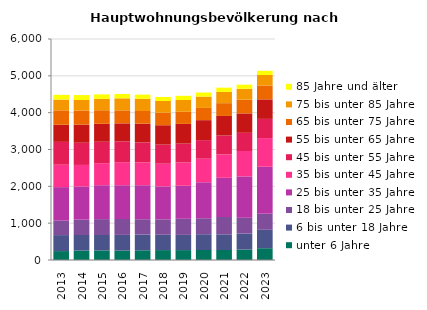
| Category | unter 6 Jahre | 6 bis unter 18 Jahre | 18 bis unter 25 Jahre | 25 bis unter 35 Jahre | 35 bis unter 45 Jahre | 45 bis unter 55 Jahre | 55 bis unter 65 Jahre | 65 bis unter 75 Jahre | 75 bis unter 85 Jahre | 85 Jahre und älter |
|---|---|---|---|---|---|---|---|---|---|---|
| 2013.0 | 242 | 434 | 392 | 911 | 608 | 620 | 464 | 392 | 293 | 128 |
| 2014.0 | 257 | 422 | 416 | 902 | 584 | 602 | 494 | 383 | 284 | 134 |
| 2015.0 | 260 | 419 | 431 | 920 | 599 | 581 | 488 | 368 | 308 | 122 |
| 2016.0 | 254 | 428 | 431 | 917 | 626 | 566 | 488 | 353 | 326 | 119 |
| 2017.0 | 263 | 428 | 416 | 923 | 620 | 542 | 509 | 344 | 329 | 116 |
| 2018.0 | 269 | 416 | 419 | 893 | 617 | 518 | 527 | 341 | 317 | 110 |
| 2019.0 | 269 | 413 | 437 | 896 | 632 | 512 | 536 | 329 | 320 | 113 |
| 2020.0 | 272 | 428 | 434 | 977 | 638 | 506 | 542 | 332 | 308 | 110 |
| 2021.0 | 272 | 425 | 470 | 1064 | 635 | 512 | 533 | 347 | 305 | 116 |
| 2022.0 | 284 | 434 | 428 | 1124 | 689 | 494 | 527 | 374 | 293 | 113 |
| 2023.0 | 320 | 500 | 437 | 1274 | 779 | 521 | 530 | 377 | 284 | 116 |